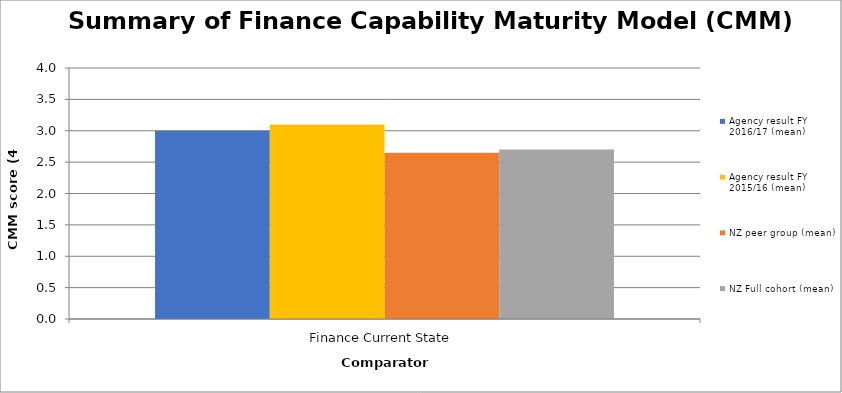
| Category | Agency result FY 2016/17 (mean) | Agency result FY 2015/16 (mean) | NZ peer group (mean) | NZ Full cohort (mean) |
|---|---|---|---|---|
| Finance Current State | 3 | 3.1 | 2.65 | 2.7 |